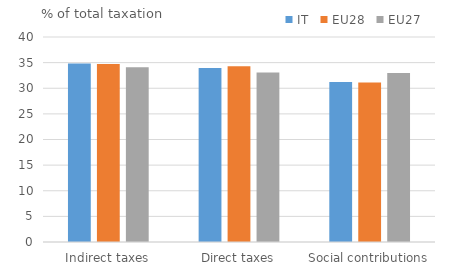
| Category | IT | EU28 | EU27 |
|---|---|---|---|
| Indirect taxes | 34.823 | 34.748 | 34.122 |
| Direct taxes | 33.971 | 34.27 | 33.09 |
| Social contributions | 31.206 | 31.135 | 32.964 |